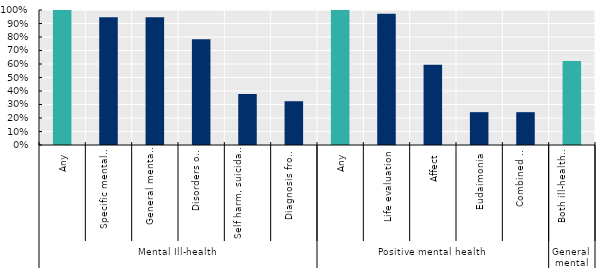
| Category | Share of countries reporting collecting each type of outcome measure |
|---|---|
| 0 | 1 |
| 1 | 0.946 |
| 2 | 0.946 |
| 3 | 0.784 |
| 4 | 0.378 |
| 5 | 0.324 |
| 6 | 1 |
| 7 | 0.973 |
| 8 | 0.595 |
| 9 | 0.243 |
| 10 | 0.243 |
| 11 | 0.622 |